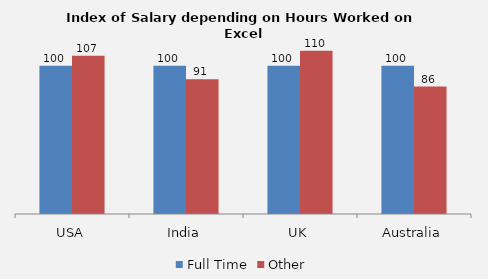
| Category | Full Time | Other |
|---|---|---|
| USA | 100 | 106.662 |
| India | 100 | 90.781 |
| UK | 100 | 110.046 |
| Australia | 100 | 85.954 |